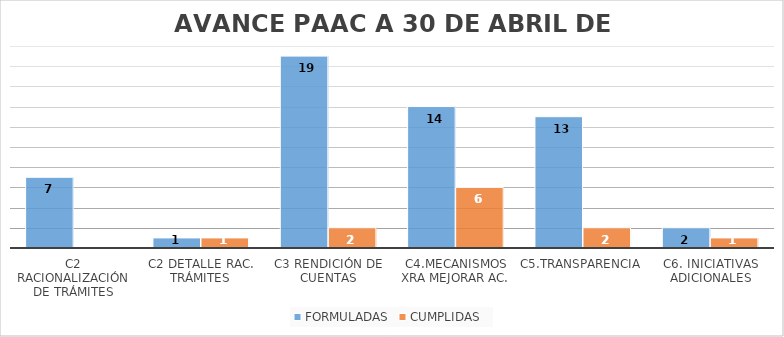
| Category | FORMULADAS | CUMPLIDAS  |
|---|---|---|
| C2 RACIONALIZACIÓN DE TRÁMITES | 7 | 0 |
| C2 DETALLE RAC. TRÁMITES | 1 | 1 |
| C3 RENDICIÓN DE CUENTAS | 19 | 2 |
| C4.MECANISMOS XRA MEJORAR AC. | 14 | 6 |
| C5.TRANSPARENCIA  | 13 | 2 |
| C6. INICIATIVAS ADICIONALES | 2 | 1 |